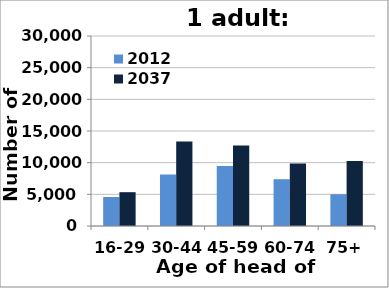
| Category | 2012 | 2037 |
|---|---|---|
| 16-29 | 4582 | 5339 |
| 30-44 | 8143 | 13361 |
| 45-59 | 9462 | 12692 |
| 60-74 | 7391 | 9855 |
| 75+ | 5023 | 10269 |